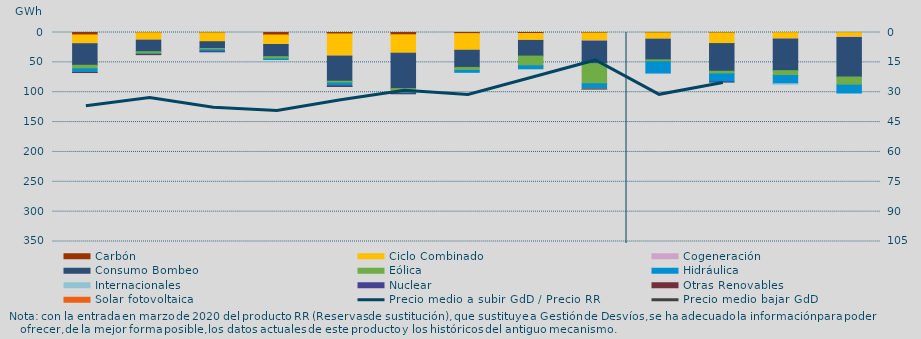
| Category | Carbón | Ciclo Combinado | Cogeneración | Consumo Bombeo | Eólica | Hidráulica | Internacionales | Nuclear | Otras Renovables | Solar fotovoltaica |
|---|---|---|---|---|---|---|---|---|---|---|
| 0 | 4042.8 | 14771.1 | 31.2 | 36027.7 | 6028.8 | 6115.8 | 0 | 0 | 35 | 0 |
| 1 | 433.4 | 12445.6 | 5 | 19266.6 | 3529.4 | 1301.2 | 0 | 0 | 5 | 0 |
| 2 | 569.3 | 14884.2 | 0 | 11390.5 | 2217.7 | 2414.5 | 0 | 870.6 | 0 | 0 |
| 3 | 4201.1 | 15848.6 | 69.7 | 20386.2 | 3745.6 | 1086.9 | 0 | 0 | 0 | 0 |
| 4 | 2463.3 | 36768.4 | 333.6 | 42011.2 | 3260.1 | 4994.6 | 0 | 253 | 107 | 0 |
| 5 | 3814.9 | 30904.9 | 78.3 | 59133.4 | 5558 | 2931.3 | 0 | 0 | 36.2 | 0 |
| 6 | 1862.6 | 27837.6 | 96.8 | 28735.2 | 5033.9 | 3139.3 | 0 | 0 | 0 | 0 |
| 7 | 1673.1 | 11548.4 | 106.4 | 26206.5 | 16242.7 | 5014.4 | 0 | 0 | 0 | 0 |
| 8 | 843.6 | 12672 | 969.2 | 37655 | 33849.3 | 9426.5 | 0 | 0 | 0 | 57.6 |
| 9 | 591.9 | 10439.5 | 218.3 | 34537.4 | 3140.7 | 19023.8 | 0 | 0 | 0 | 0 |
| 10 | 683.9 | 17734.4 | 130.3 | 46367.6 | 4484.5 | 13296.6 | 0 | 160.1 | 0 | 0 |
| 11 | 266 | 10455 | 302 | 52908 | 8236.7 | 13611 | 100 | 0 | 0 | 0 |
| 12 | 248 | 7191 | 798 | 66283 | 13648 | 13179 | 0 | 0 | 0 | 0 |